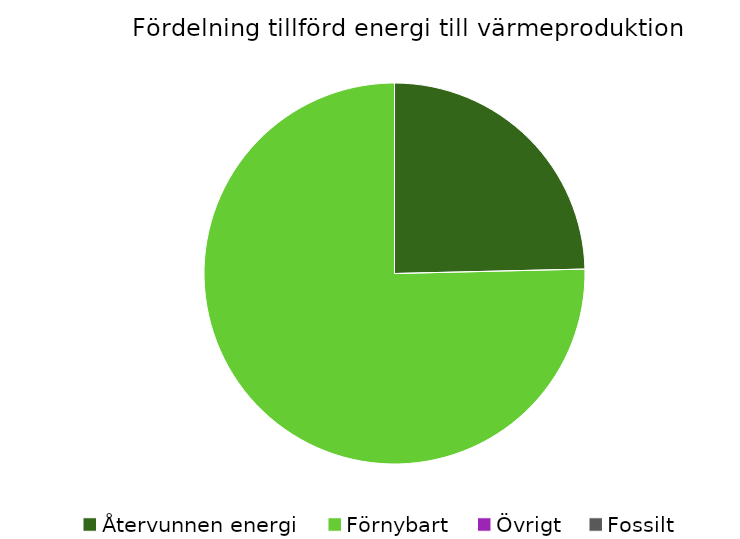
| Category | Fördelning värmeproduktion |
|---|---|
| Återvunnen energi | 0.246 |
| Förnybart | 0.754 |
| Övrigt | 0 |
| Fossilt | 0 |